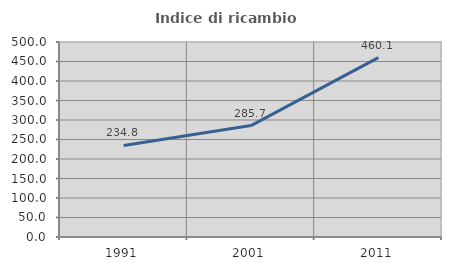
| Category | Indice di ricambio occupazionale  |
|---|---|
| 1991.0 | 234.809 |
| 2001.0 | 285.714 |
| 2011.0 | 460.061 |